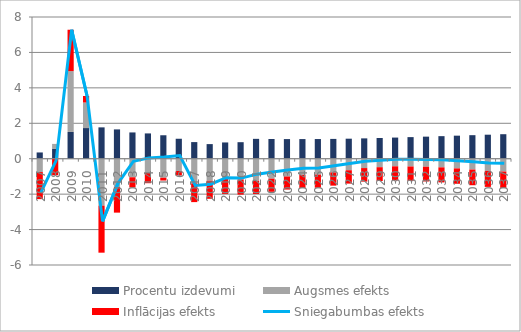
| Category | Procentu izdevumi | Augsmes efekts | Inflācijas efekts |
|---|---|---|---|
| 0 | 0.353 | -0.754 | -1.527 |
| 1 | 0.551 | 0.285 | -0.933 |
| 2 | 1.511 | 3.434 | 2.337 |
| 3 | 1.731 | 1.442 | 0.368 |
| 4 | 1.77 | -2.65 | -2.655 |
| 5 | 1.655 | -1.594 | -1.45 |
| 6 | 1.483 | -1.047 | -0.579 |
| 7 | 1.428 | -0.798 | -0.585 |
| 8 | 1.324 | -1.075 | -0.157 |
| 9 | 1.127 | -0.694 | -0.255 |
| 10 | 0.938 | -1.39 | -1.06 |
| 11 | 0.825 | -1.245 | -1.018 |
| 12 | 0.918 | -1.135 | -0.853 |
| 13 | 0.933 | -1.17 | -0.858 |
| 14 | 1.121 | -1.245 | -0.748 |
| 15 | 1.112 | -1.126 | -0.742 |
| 16 | 1.108 | -1.003 | -0.739 |
| 17 | 1.109 | -0.912 | -0.739 |
| 18 | 1.111 | -0.898 | -0.74 |
| 19 | 1.118 | -0.774 | -0.745 |
| 20 | 1.131 | -0.651 | -0.754 |
| 21 | 1.148 | -0.528 | -0.766 |
| 22 | 1.169 | -0.479 | -0.78 |
| 23 | 1.194 | -0.43 | -0.796 |
| 24 | 1.219 | -0.439 | -0.813 |
| 25 | 1.246 | -0.453 | -0.831 |
| 26 | 1.274 | -0.488 | -0.849 |
| 27 | 1.301 | -0.547 | -0.868 |
| 28 | 1.329 | -0.611 | -0.886 |
| 29 | 1.356 | -0.687 | -0.904 |
| 30 | 1.383 | -0.724 | -0.922 |